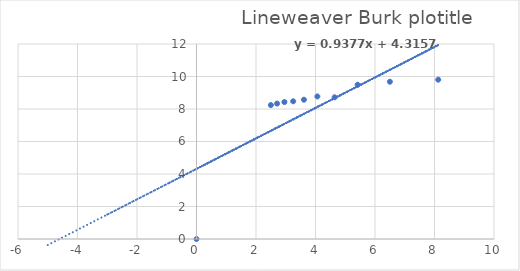
| Category | Series 0 |
|---|---|
| 0.0 | 0 |
| 8.125 | 9.804 |
| 6.5 | 9.677 |
| 5.416666666666667 | 9.494 |
| 4.642857142857143 | 8.721 |
| 4.0625 | 8.772 |
| 3.6111111111111107 | 8.571 |
| 3.25 | 8.475 |
| 2.9545454545454546 | 8.427 |
| 2.7083333333333335 | 8.333 |
| 2.5 | 8.242 |